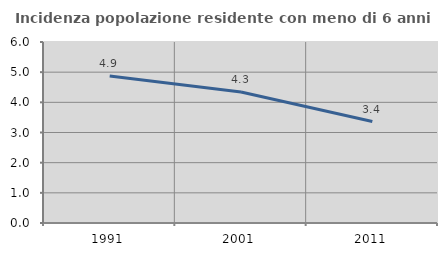
| Category | Incidenza popolazione residente con meno di 6 anni |
|---|---|
| 1991.0 | 4.876 |
| 2001.0 | 4.344 |
| 2011.0 | 3.363 |